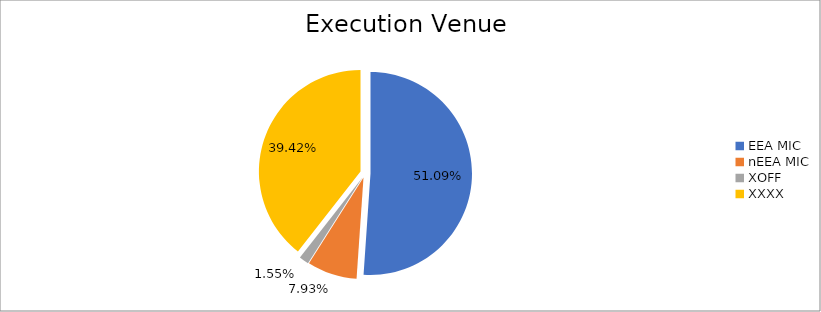
| Category | Series 0 |
|---|---|
| EEA MIC | 6535437.533 |
| nEEA MIC | 1014356.154 |
| XOFF | 198832.403 |
| XXXX | 5043125.807 |